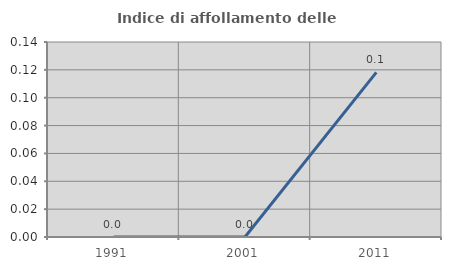
| Category | Indice di affollamento delle abitazioni  |
|---|---|
| 1991.0 | 0 |
| 2001.0 | 0 |
| 2011.0 | 0.118 |